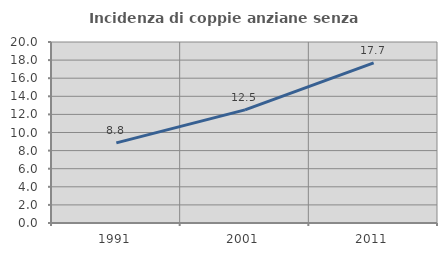
| Category | Incidenza di coppie anziane senza figli  |
|---|---|
| 1991.0 | 8.85 |
| 2001.0 | 12.5 |
| 2011.0 | 17.692 |